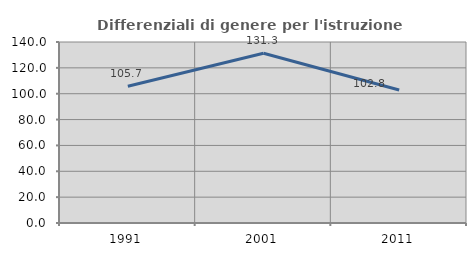
| Category | Differenziali di genere per l'istruzione superiore |
|---|---|
| 1991.0 | 105.73 |
| 2001.0 | 131.295 |
| 2011.0 | 102.826 |